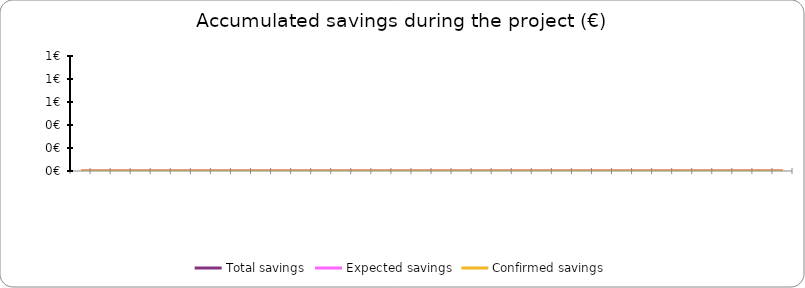
| Category | Total savings | Expected savings | Confirmed savings |
|---|---|---|---|
|  | 0 | 0 | 0 |
|  | 0 | 0 | 0 |
|  | 0 | 0 | 0 |
|  | 0 | 0 | 0 |
|  | 0 | 0 | 0 |
|  | 0 | 0 | 0 |
|  | 0 | 0 | 0 |
|  | 0 | 0 | 0 |
|  | 0 | 0 | 0 |
|  | 0 | 0 | 0 |
|  | 0 | 0 | 0 |
|  | 0 | 0 | 0 |
|  | 0 | 0 | 0 |
|  | 0 | 0 | 0 |
|  | 0 | 0 | 0 |
|  | 0 | 0 | 0 |
|  | 0 | 0 | 0 |
|  | 0 | 0 | 0 |
|  | 0 | 0 | 0 |
|  | 0 | 0 | 0 |
|  | 0 | 0 | 0 |
|  | 0 | 0 | 0 |
|  | 0 | 0 | 0 |
|  | 0 | 0 | 0 |
|  | 0 | 0 | 0 |
|  | 0 | 0 | 0 |
|  | 0 | 0 | 0 |
|  | 0 | 0 | 0 |
|  | 0 | 0 | 0 |
|  | 0 | 0 | 0 |
|  | 0 | 0 | 0 |
|  | 0 | 0 | 0 |
|  | 0 | 0 | 0 |
|  | 0 | 0 | 0 |
|  | 0 | 0 | 0 |
|  | 0 | 0 | 0 |